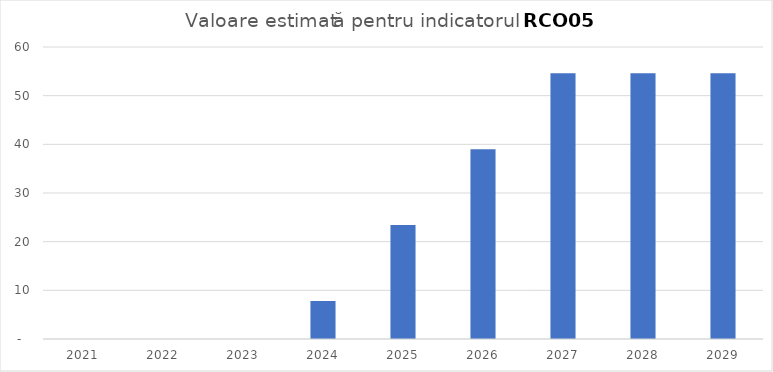
| Category | Series 0 |
|---|---|
| 2021.0 | 0 |
| 2022.0 | 0 |
| 2023.0 | 0 |
| 2024.0 | 7.802 |
| 2025.0 | 23.406 |
| 2026.0 | 39.011 |
| 2027.0 | 54.615 |
| 2028.0 | 54.615 |
| 2029.0 | 54.615 |